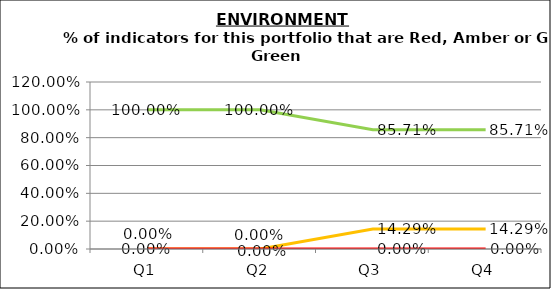
| Category | Green | Amber | Red |
|---|---|---|---|
| Q1 | 1 | 0 | 0 |
| Q2 | 1 | 0 | 0 |
| Q3 | 0.857 | 0.143 | 0 |
| Q4 | 0.857 | 0.143 | 0 |